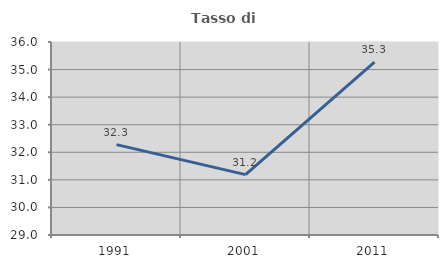
| Category | Tasso di occupazione   |
|---|---|
| 1991.0 | 32.278 |
| 2001.0 | 31.19 |
| 2011.0 | 35.268 |